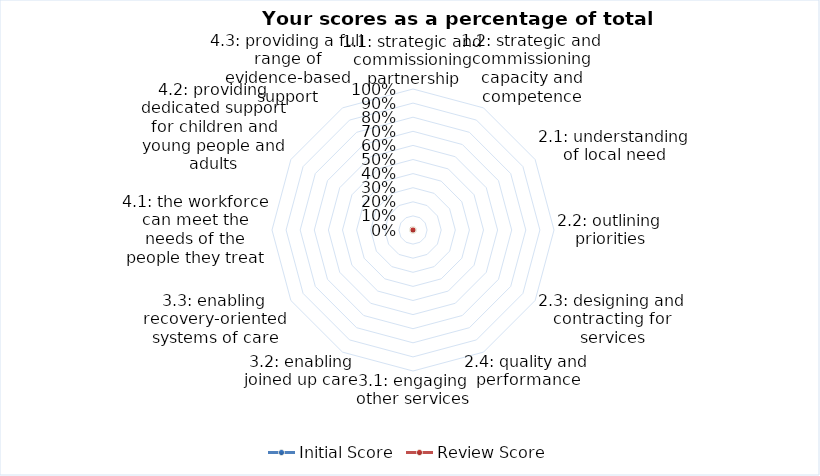
| Category | Initial Score | Review Score |
|---|---|---|
| 1.1: strategic and commissioning partnership | 0 | 0 |
| 1.2: strategic and commissioning capacity and competence | 0 | 0 |
| 2.1: understanding of local need | 0 | 0 |
| 2.2: outlining priorities | 0 | 0 |
| 2.3: designing and contracting for services | 0 | 0 |
| 2.4: quality and performance | 0 | 0 |
| 3.1: engaging other services | 0 | 0 |
| 3.2: enabling joined up care | 0 | 0 |
| 3.3: enabling recovery-oriented systems of care | 0 | 0 |
| 4.1: the workforce can meet the needs of the people they treat | 0 | 0 |
| 4.2: providing dedicated support for children and young people and adults | 0 | 0 |
| 4.3: providing a full range of evidence-based support | 0 | 0 |